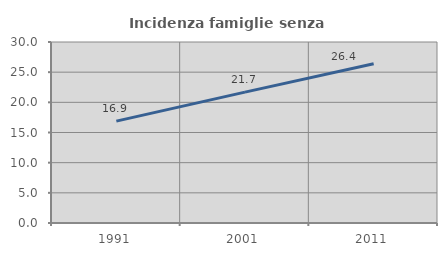
| Category | Incidenza famiglie senza nuclei |
|---|---|
| 1991.0 | 16.891 |
| 2001.0 | 21.696 |
| 2011.0 | 26.4 |